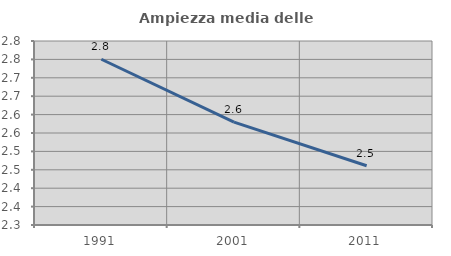
| Category | Ampiezza media delle famiglie |
|---|---|
| 1991.0 | 2.75 |
| 2001.0 | 2.58 |
| 2011.0 | 2.461 |